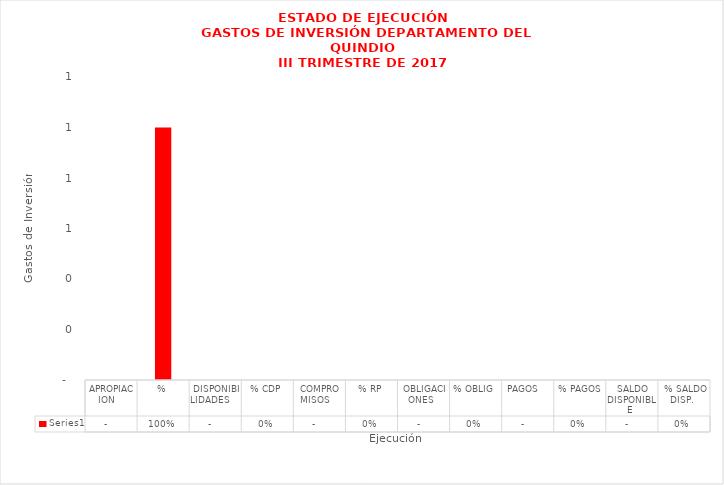
| Category | Series 0 |
|---|---|
| APROPIACION   | 0 |
| % | 1 |
| DISPONIBILIDADES    | 0 |
| % CDP | 0 |
| COMPROMISOS   | 0 |
| % RP | 0 |
| OBLIGACIONES  | 0 |
| % OBLIG | 0 |
| PAGOS   | 0 |
| % PAGOS | 0 |
| SALDO DISPONIBLE | 0 |
| % SALDO DISP. | 0 |